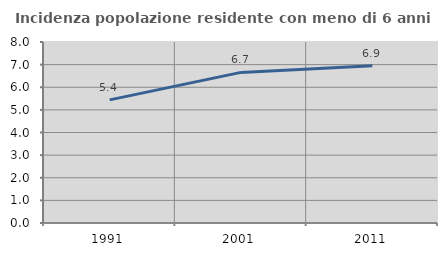
| Category | Incidenza popolazione residente con meno di 6 anni |
|---|---|
| 1991.0 | 5.443 |
| 2001.0 | 6.657 |
| 2011.0 | 6.945 |